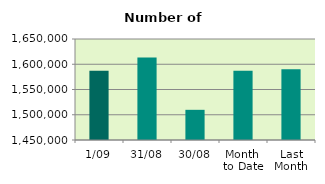
| Category | Series 0 |
|---|---|
| 1/09 | 1587052 |
| 31/08 | 1613612 |
| 30/08 | 1509752 |
| Month 
to Date | 1587052 |
| Last
Month | 1590000.087 |